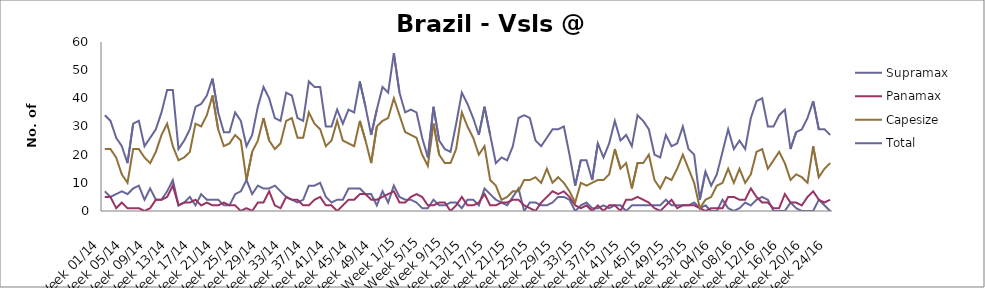
| Category | Supramax | Panamax | Capesize | Total |
|---|---|---|---|---|
| Week 01/14 | 7 | 5 | 22 | 34 |
| Week 02/14 | 5 | 5 | 22 | 32 |
| Week 03/14 | 6 | 1 | 19 | 26 |
| Week 04/14 | 7 | 3 | 13 | 23 |
| Week 05/14 | 6 | 1 | 10 | 17 |
| Week 06/14 | 8 | 1 | 22 | 31 |
| Week 07/14 | 9 | 1 | 22 | 32 |
| Week 08/14 | 4 | 0 | 19 | 23 |
| Week 09/14 | 8 | 1 | 17 | 26 |
| Week 10/14 | 4 | 4 | 21 | 29 |
| Week 11/14 | 4 | 4 | 27 | 35 |
| Week 12/14 | 7 | 5 | 31 | 43 |
| Week 13/14 | 11 | 9 | 23 | 43 |
| Week 14/14 | 2 | 2 | 18 | 22 |
| Week 15/14 | 3 | 3 | 19 | 25 |
| Week 16/14 | 5 | 3 | 21 | 29 |
| Week 17/14 | 2 | 4 | 31 | 37 |
| Week 18/14 | 6 | 2 | 30 | 38 |
| Week 19/14 | 4 | 3 | 34 | 41 |
| Week 20/14 | 4 | 2 | 41 | 47 |
| Week 21/14 | 4 | 2 | 29 | 35 |
| Week 22/14 | 2 | 3 | 23 | 28 |
| Week 23/14 | 2 | 2 | 24 | 28 |
| Week 24/14 | 6 | 2 | 27 | 35 |
| Week 25/14 | 7 | 0 | 25 | 32 |
| Week 26/14 | 11 | 1 | 11 | 23 |
| Week 27/14 | 6 | 0 | 21 | 27 |
| Week 28/14 | 9 | 3 | 25 | 37 |
| Week 29/14 | 8 | 3 | 33 | 44 |
| Week 30/14 | 8 | 7 | 25 | 40 |
| Week 31/14 | 9 | 2 | 22 | 33 |
| Week 32/14 | 7 | 1 | 24 | 32 |
| Week 33/14 | 5 | 5 | 32 | 42 |
| Week 34/14 | 4 | 4 | 33 | 41 |
| Week 35/14 | 3 | 4 | 26 | 33 |
| Week 36/14 | 4 | 2 | 26 | 32 |
| Week 37/14 | 9 | 2 | 35 | 46 |
| Week 38/14 | 9 | 4 | 31 | 44 |
| Week 39/14 | 10 | 5 | 29 | 44 |
| Week 40/14 | 5 | 2 | 23 | 30 |
| Week 41/14 | 3 | 2 | 25 | 30 |
| Week 42/14 | 4 | 0 | 32 | 36 |
| Week 43/14 | 4 | 2 | 25 | 31 |
| Week 44/14 | 8 | 4 | 24 | 36 |
| Week 45/14 | 8 | 4 | 23 | 35 |
| Week 46/14 | 8 | 6 | 32 | 46 |
| Week 47/14 | 6 | 6 | 25 | 37 |
| Week 48/14 | 6 | 4 | 17 | 27 |
| Week 49/14 | 2 | 4 | 30 | 36 |
| Week 50/14 | 7 | 5 | 32 | 44 |
| Week 51/14 | 3 | 6 | 33 | 42 |
| Week 52/14 | 9 | 7 | 40 | 56 |
| Week 1/15 | 5 | 3 | 34 | 42 |
| Week 2/15 | 4 | 3 | 28 | 35 |
| Week 3/15 | 4 | 5 | 27 | 36 |
| Week 4/15 | 3 | 6 | 26 | 35 |
| Week 5/15 | 1 | 5 | 20 | 26 |
| Week 6/15 | 1 | 2 | 16 | 19 |
| Week 7/15 | 4 | 2 | 31 | 37 |
| Week 8/15 | 2 | 3 | 20 | 25 |
| Week 9/15 | 2 | 3 | 17 | 22 |
| Week 10/15 | 3 | 0 | 17 | 21 |
| Week 11/15 | 3 | 2 | 22 | 31 |
| Week 12/15 | 1 | 5 | 35 | 42 |
| Week 13/15 | 4 | 2 | 30 | 38 |
| Week 14/15 | 4 | 2 | 26 | 33 |
| Week 15/15 | 2 | 3 | 20 | 27 |
| Week 16/15 | 8 | 6 | 23 | 37 |
| Week 17/15 | 6 | 2 | 11 | 27 |
| Week 18/15 | 4 | 2 | 9 | 17 |
| Week 19/15 | 3 | 3 | 4 | 19 |
| Week 20/15 | 2 | 3 | 5 | 18 |
| Week 21/15 | 5 | 4 | 7 | 23 |
| Week 22/15 | 8 | 4 | 7 | 33 |
| Week 23/15 | 0 | 2 | 11 | 34 |
| Week 24/15 | 3 | 1 | 11 | 33 |
| Week 25/15 | 3 | 0 | 12 | 25 |
| Week 26/15 | 2 | 3 | 10 | 23 |
| Week 27/15 | 2 | 5 | 15 | 26 |
| Week 28/15 | 3 | 7 | 10 | 29 |
| Week 29/15 | 5 | 6 | 12 | 29 |
| Week 30/15 | 5 | 7 | 10 | 30 |
| Week 31/15 | 4 | 5 | 7 | 20 |
| Week 32/15 | 0 | 2 | 3 | 9 |
| Week 33/15 | 2 | 1 | 10 | 18 |
| Week 34/15 | 3 | 2 | 9 | 18 |
| Week 35/15 | 1 | 0 | 10 | 11 |
| Week 36/15 | 1 | 2 | 11 | 24 |
| Week 37/15 | 2 | 0 | 11 | 19 |
| Week 38/15 | 1 | 2 | 13 | 24 |
| Week 39/15 | 2 | 2 | 22 | 32 |
| Week 40/15 | 2 | 0 | 15 | 25 |
| Week 41/15 | 0 | 4 | 17 | 27 |
| Week 42/15 | 2 | 4 | 8 | 23 |
| Week 43/15 | 2 | 5 | 17 | 34 |
| Week 44/15 | 2 | 4 | 17 | 32 |
| Week 45/15 | 2 | 3 | 20 | 29 |
| Week 46/15 | 2 | 1 | 11 | 20 |
| Week 47/15 | 2 | 0 | 8 | 19 |
| Week 48/15 | 4 | 2 | 12 | 27 |
| Week 49/15 | 2 | 4 | 11 | 23 |
| Week 50/15 | 2 | 1 | 15 | 24 |
| Week 51/15 | 2 | 2 | 20 | 30 |
| Week 52/15 | 2 | 2 | 15 | 22 |
| Week 53/15 | 3 | 2 | 10 | 20 |
| Week 01/16 | 1 | 1 | 1 | 4 |
| Week 02/16 | 2 | 0 | 4 | 14 |
| Week 03/16 | 0 | 1 | 5 | 9 |
| Week 04/16 | 0 | 1 | 9 | 13 |
| Week 05/16 | 4 | 1 | 10 | 21 |
| Week 06/16 | 1 | 5 | 15 | 29 |
| Week 07/16 | 0 | 5 | 10 | 22 |
| Week 08/16 | 1 | 4 | 15 | 25 |
| Week 09/16 | 3 | 4 | 10 | 22 |
| Week 10/16 | 2 | 8 | 13 | 33 |
| Week 11/16 | 4 | 5 | 21 | 39 |
| Week 12/16 | 5 | 3 | 22 | 40 |
| Week 13/16 | 4 | 3 | 15 | 30 |
| Week 14/16 | 0 | 1 | 18 | 30 |
| Week 15/16 | 0 | 1 | 21 | 34 |
| Week 16/16 | 0 | 6 | 17 | 36 |
| Week 17/16 | 3 | 3 | 11 | 22 |
| Week 18/16 | 1 | 3 | 13 | 28 |
| Week 19/16 | 0 | 2 | 12 | 29 |
| Week 20/16 | 0 | 5 | 10 | 33 |
| Week 21/16 | 0 | 7 | 23 | 39 |
| Week 22/16 | 4 | 4 | 12 | 29 |
| Week 23/16 | 2 | 3 | 15 | 29 |
| Week 24/16 | 0 | 4 | 17 | 27 |